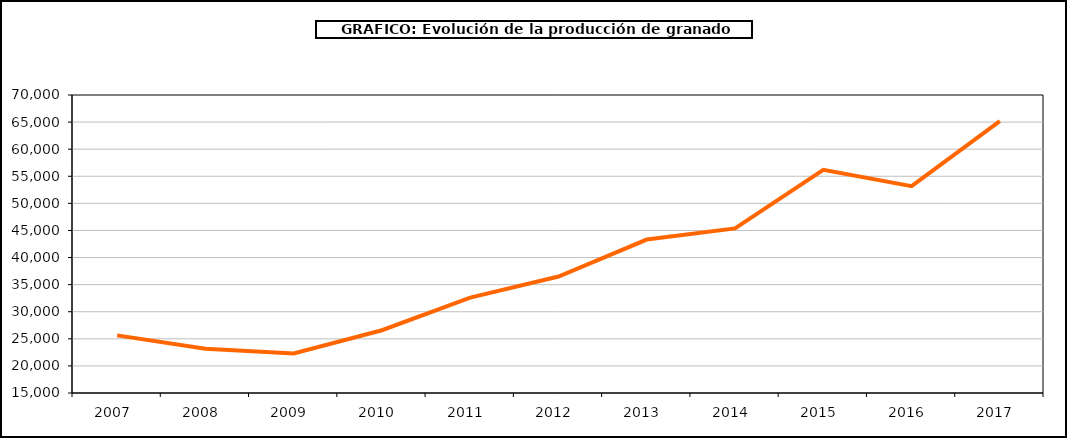
| Category | producción granado |
|---|---|
| 2007.0 | 25632 |
| 2008.0 | 23169 |
| 2009.0 | 22311 |
| 2010.0 | 26582 |
| 2011.0 | 32606 |
| 2012.0 | 36495 |
| 2013.0 | 43324 |
| 2014.0 | 45382 |
| 2015.0 | 56185 |
| 2016.0 | 53187 |
| 2017.0 | 65165 |